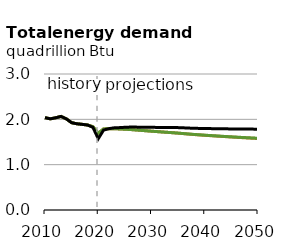
| Category | EAC | DAC | Reference |
|---|---|---|---|
| 2010.0 | 2.037 | 2.037 | 2.037 |
| 2011.0 | 2.012 | 2.012 | 2.012 |
| 2012.0 | 2.034 | 2.034 | 2.034 |
| 2013.0 | 2.064 | 2.064 | 2.064 |
| 2014.0 | 2.01 | 2.01 | 2.01 |
| 2015.0 | 1.926 | 1.926 | 1.926 |
| 2016.0 | 1.902 | 1.902 | 1.902 |
| 2017.0 | 1.889 | 1.889 | 1.889 |
| 2018.0 | 1.874 | 1.874 | 1.874 |
| 2019.0 | 1.838 | 1.838 | 1.824 |
| 2020.0 | 1.695 | 1.694 | 1.572 |
| 2021.0 | 1.787 | 1.787 | 1.763 |
| 2022.0 | 1.794 | 1.794 | 1.794 |
| 2023.0 | 1.795 | 1.795 | 1.813 |
| 2024.0 | 1.787 | 1.787 | 1.817 |
| 2025.0 | 1.782 | 1.782 | 1.824 |
| 2026.0 | 1.775 | 1.775 | 1.829 |
| 2027.0 | 1.766 | 1.766 | 1.828 |
| 2028.0 | 1.757 | 1.757 | 1.827 |
| 2029.0 | 1.748 | 1.748 | 1.825 |
| 2030.0 | 1.739 | 1.739 | 1.824 |
| 2031.0 | 1.73 | 1.73 | 1.822 |
| 2032.0 | 1.721 | 1.721 | 1.821 |
| 2033.0 | 1.713 | 1.713 | 1.82 |
| 2034.0 | 1.705 | 1.705 | 1.82 |
| 2035.0 | 1.695 | 1.696 | 1.817 |
| 2036.0 | 1.684 | 1.686 | 1.813 |
| 2037.0 | 1.674 | 1.676 | 1.807 |
| 2038.0 | 1.664 | 1.667 | 1.802 |
| 2039.0 | 1.656 | 1.659 | 1.8 |
| 2040.0 | 1.648 | 1.651 | 1.797 |
| 2041.0 | 1.64 | 1.643 | 1.795 |
| 2042.0 | 1.632 | 1.636 | 1.794 |
| 2043.0 | 1.625 | 1.628 | 1.792 |
| 2044.0 | 1.617 | 1.621 | 1.79 |
| 2045.0 | 1.61 | 1.614 | 1.789 |
| 2046.0 | 1.603 | 1.607 | 1.788 |
| 2047.0 | 1.596 | 1.601 | 1.786 |
| 2048.0 | 1.59 | 1.595 | 1.785 |
| 2049.0 | 1.583 | 1.588 | 1.784 |
| 2050.0 | 1.576 | 1.582 | 1.783 |